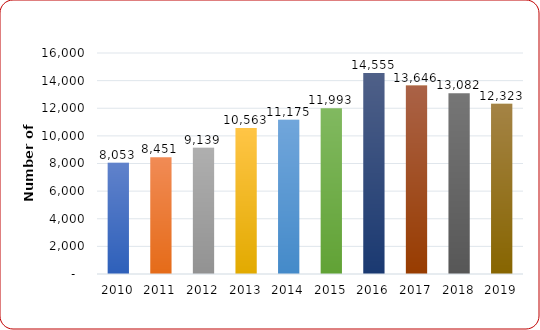
| Category | Total Graduates |
|---|---|
| 2010.0 | 8053 |
| 2011.0 | 8451 |
| 2012.0 | 9139 |
| 2013.0 | 10563 |
| 2014.0 | 11175 |
| 2015.0 | 11993 |
| 2016.0 | 14555 |
| 2017.0 | 13646 |
| 2018.0 | 13082 |
| 2019.0 | 12323 |